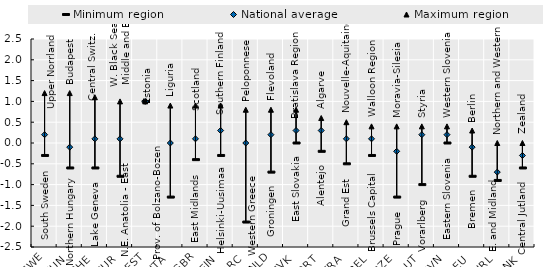
| Category | Minimum region | National average | Maximum region |
|---|---|---|---|
| SWE | -0.3 | 0.2 | 1.2 |
| HUN | -0.6 | -0.1 | 1.2 |
| CHE | -0.6 | 0.1 | 1.1 |
| TUR | -0.8 | 0.1 | 1 |
| EST | 1 | 1 | 1 |
| ITA | -1.3 | 0 | 0.9 |
| GBR | -0.4 | 0.1 | 0.9 |
| FIN | -0.3 | 0.3 | 0.9 |
| GRC | -1.9 | 0 | 0.8 |
| NLD | -0.7 | 0.2 | 0.8 |
| SVK | 0 | 0.3 | 0.8 |
| PRT | -0.2 | 0.3 | 0.6 |
| FRA | -0.5 | 0.1 | 0.5 |
| BEL | -0.3 | 0.1 | 0.4 |
| CZE | -1.3 | -0.2 | 0.4 |
| AUT | -1 | 0.2 | 0.4 |
| SVN | 0 | 0.2 | 0.4 |
| DEU | -0.8 | -0.1 | 0.3 |
| IRL | -0.9 | -0.7 | 0 |
| DNK | -0.6 | -0.3 | 0 |